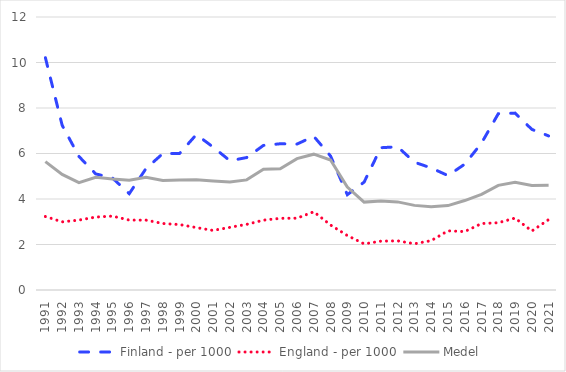
| Category | Finland - per 1000 | England - per 1000 | Medel |
|---|---|---|---|
| 1991.0 | 10.212 | 3.229 | 5.644 |
| 1992.0 | 7.239 | 2.997 | 5.079 |
| 1993.0 | 5.87 | 3.073 | 4.718 |
| 1994.0 | 5.104 | 3.206 | 4.956 |
| 1995.0 | 4.922 | 3.248 | 4.882 |
| 1996.0 | 4.234 | 3.073 | 4.826 |
| 1997.0 | 5.341 | 3.072 | 4.956 |
| 1998.0 | 5.996 | 2.922 | 4.809 |
| 1999.0 | 6.001 | 2.876 | 4.834 |
| 2000.0 | 6.831 | 2.744 | 4.844 |
| 2001.0 | 6.282 | 2.619 | 4.787 |
| 2002.0 | 5.682 | 2.754 | 4.744 |
| 2003.0 | 5.822 | 2.885 | 4.841 |
| 2004.0 | 6.356 | 3.069 | 5.303 |
| 2005.0 | 6.428 | 3.151 | 5.333 |
| 2006.0 | 6.414 | 3.156 | 5.775 |
| 2007.0 | 6.754 | 3.438 | 5.97 |
| 2008.0 | 5.889 | 2.856 | 5.712 |
| 2009.0 | 4.19 | 2.394 | 4.523 |
| 2010.0 | 4.741 | 2.027 | 3.863 |
| 2011.0 | 6.254 | 2.147 | 3.914 |
| 2012.0 | 6.295 | 2.161 | 3.873 |
| 2013.0 | 5.617 | 2.032 | 3.72 |
| 2014.0 | 5.365 | 2.169 | 3.655 |
| 2015.0 | 5.03 | 2.601 | 3.71 |
| 2016.0 | 5.532 | 2.567 | 3.932 |
| 2017.0 | 6.458 | 2.921 | 4.203 |
| 2018.0 | 7.749 | 2.956 | 4.599 |
| 2019.0 | 7.775 | 3.16 | 4.735 |
| 2020.0 | 7.06 | 2.593 | 4.596 |
| 2021.0 | 6.773 | 3.094 | 4.608 |